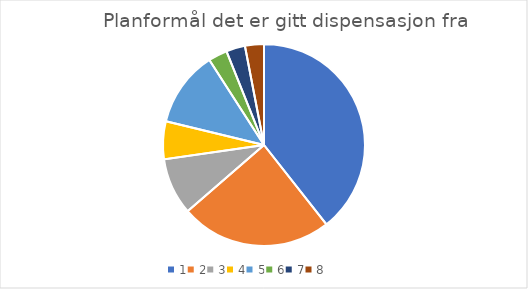
| Category | Series 0 |
|---|---|
| 0 | 13 |
| 1 | 8 |
| 2 | 3 |
| 3 | 2 |
| 4 | 4 |
| 5 | 1 |
| 6 | 1 |
| 7 | 1 |